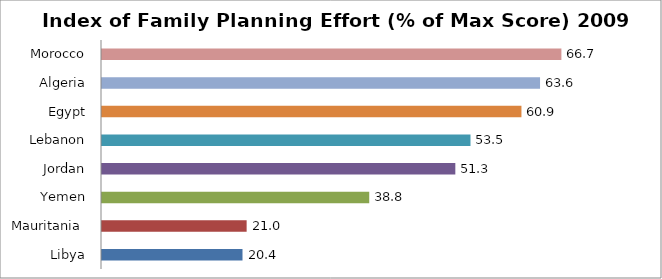
| Category | Index of family planning effort (percentage of maximum score) 2009 |
|---|---|
| Libya | 20.4 |
| Mauritania  | 21 |
| Yemen | 38.8 |
| Jordan | 51.3 |
| Lebanon | 53.5 |
| Egypt | 60.9 |
| Algeria | 63.6 |
| Morocco | 66.7 |